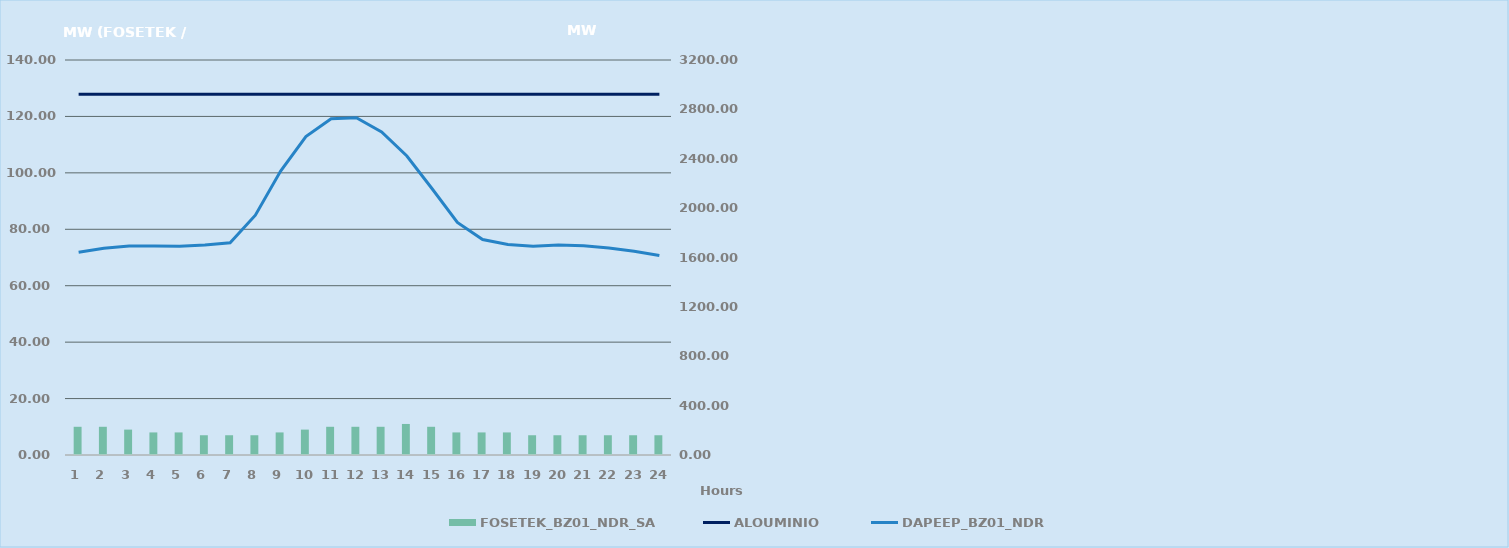
| Category | FOSETEK_BZ01_NDR_SA |
|---|---|
| 0 | 10 |
| 1 | 10 |
| 2 | 9 |
| 3 | 8 |
| 4 | 8 |
| 5 | 7 |
| 6 | 7 |
| 7 | 7 |
| 8 | 8 |
| 9 | 9 |
| 10 | 10 |
| 11 | 10 |
| 12 | 10 |
| 13 | 11 |
| 14 | 10 |
| 15 | 8 |
| 16 | 8 |
| 17 | 8 |
| 18 | 7 |
| 19 | 7 |
| 20 | 7 |
| 21 | 7 |
| 22 | 7 |
| 23 | 7 |